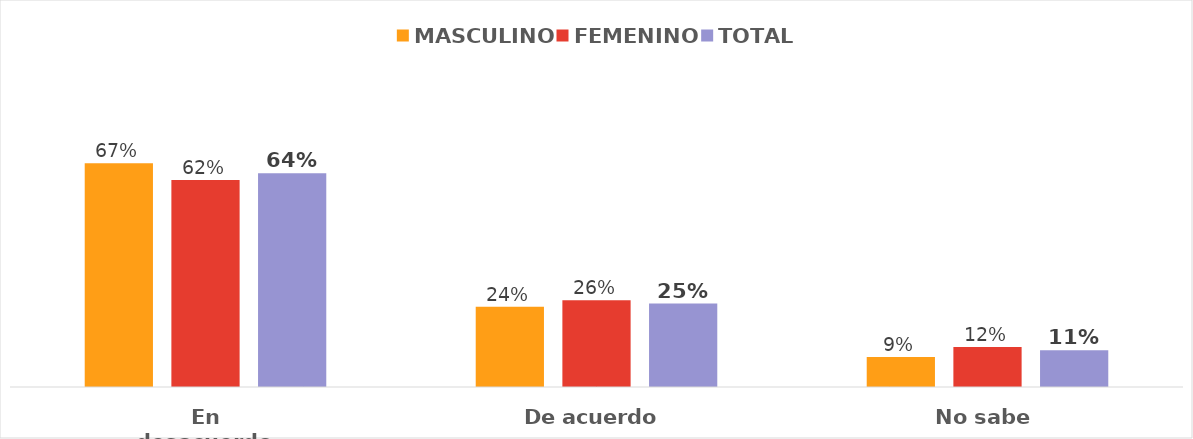
| Category | MASCULINO | FEMENINO | TOTAL |
|---|---|---|---|
| En desacuerdo | 0.67 | 0.62 | 0.64 |
| De acuerdo | 0.24 | 0.26 | 0.25 |
| No sabe | 0.09 | 0.12 | 0.11 |